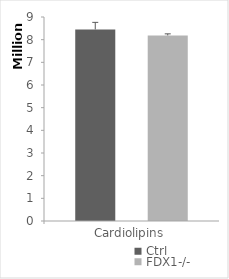
| Category | Ctrl | FDX1-/- |
|---|---|---|
| Cardiolipins | 8451504.504 | 8187702.328 |